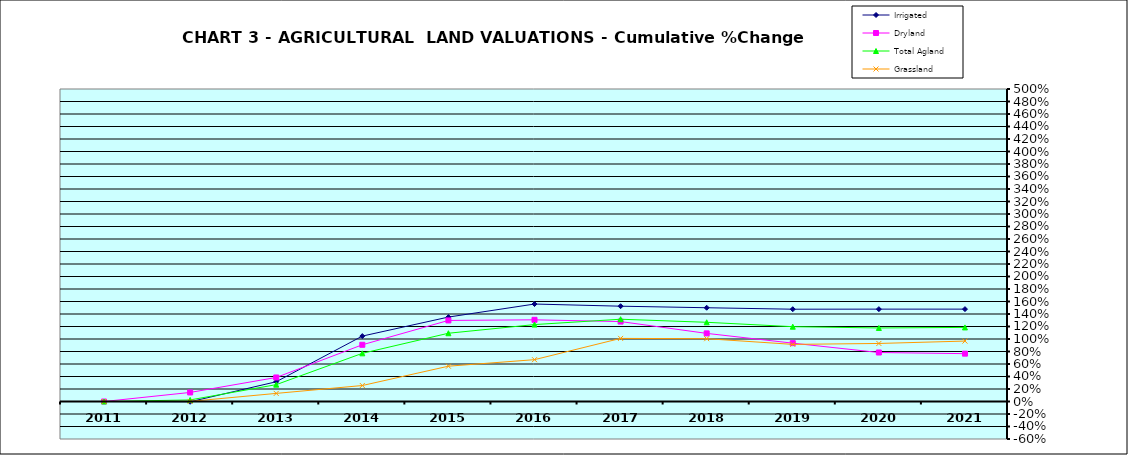
| Category | Irrigated | Dryland | Total Agland | Grassland |
|---|---|---|---|---|
| 2011.0 | 0 | 0 | 0 | 0 |
| 2012.0 | -0.004 | 0.145 | 0.025 | 0.002 |
| 2013.0 | 0.316 | 0.384 | 0.27 | 0.13 |
| 2014.0 | 1.047 | 0.907 | 0.771 | 0.256 |
| 2015.0 | 1.351 | 1.297 | 1.092 | 0.565 |
| 2016.0 | 1.559 | 1.307 | 1.231 | 0.669 |
| 2017.0 | 1.525 | 1.279 | 1.316 | 1.01 |
| 2018.0 | 1.5 | 1.09 | 1.267 | 1.005 |
| 2019.0 | 1.477 | 0.933 | 1.197 | 0.914 |
| 2020.0 | 1.478 | 0.784 | 1.177 | 0.929 |
| 2021.0 | 1.478 | 0.766 | 1.185 | 0.967 |